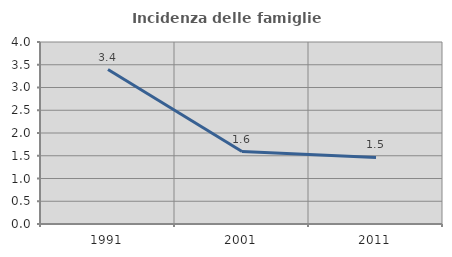
| Category | Incidenza delle famiglie numerose |
|---|---|
| 1991.0 | 3.395 |
| 2001.0 | 1.593 |
| 2011.0 | 1.463 |